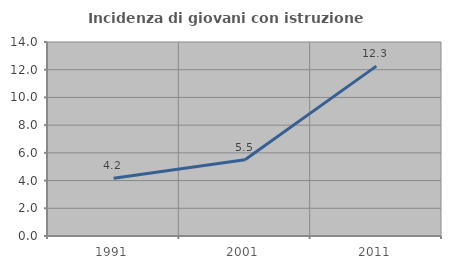
| Category | Incidenza di giovani con istruzione universitaria |
|---|---|
| 1991.0 | 4.167 |
| 2001.0 | 5.502 |
| 2011.0 | 12.261 |